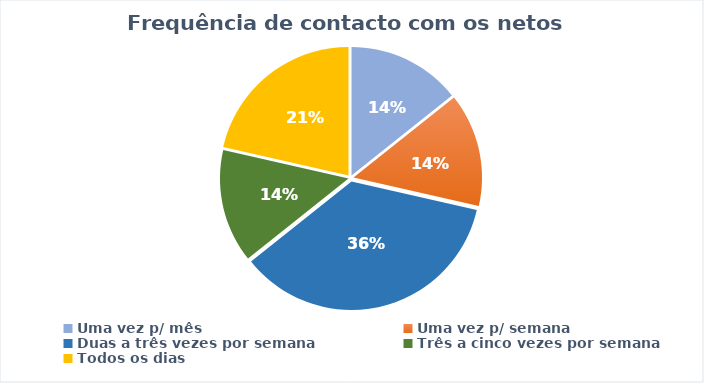
| Category | Series 0 |
|---|---|
| Uma vez p/ mês | 2 |
| Uma vez p/ semana | 2 |
| Duas a três vezes por semana | 5 |
| Três a cinco vezes por semana | 2 |
| Todos os dias | 3 |